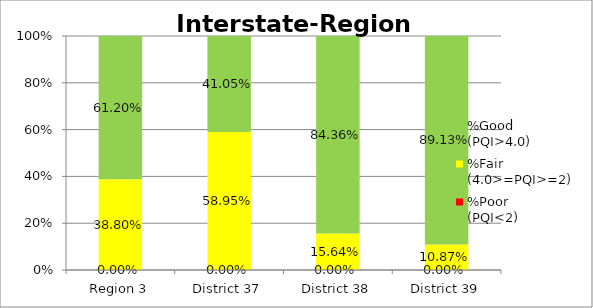
| Category | %Poor
(PQI<2) | %Fair
(4.0>=PQI>=2) | %Good
(PQI>4.0) |
|---|---|---|---|
| Region 3 | 0 | 0.388 | 0.612 |
| District 37 | 0 | 0.59 | 0.41 |
| District 38 | 0 | 0.156 | 0.844 |
| District 39 | 0 | 0.109 | 0.891 |